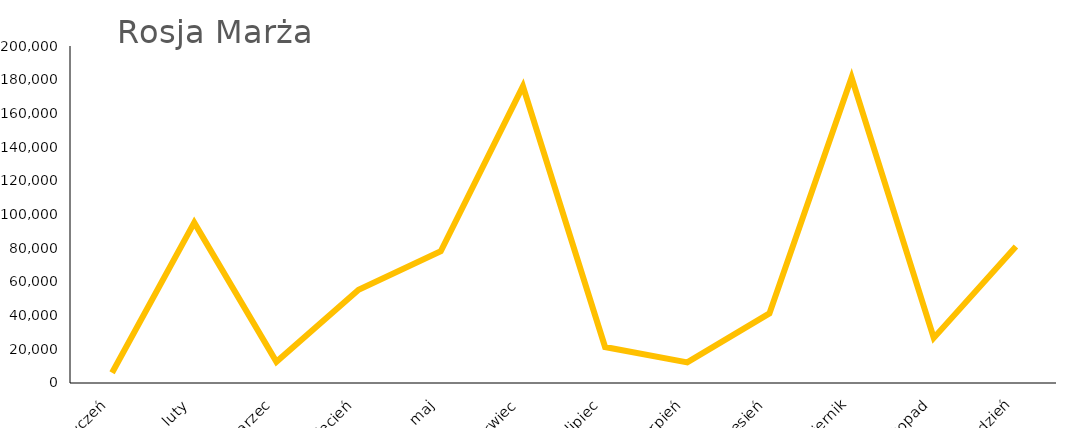
| Category | Rosja Marża |
|---|---|
| styczeń | 6120.818 |
| luty | 95170.355 |
| marzec | 12555 |
| kwiecień | 55390.354 |
| maj | 78185.231 |
| czerwiec | 176084.833 |
| lipiec | 21350.289 |
| sierpień | 12222 |
| wrzesień | 41312.691 |
| październik | 181267.15 |
| listopad | 26746.549 |
| grudzień | 80963.904 |